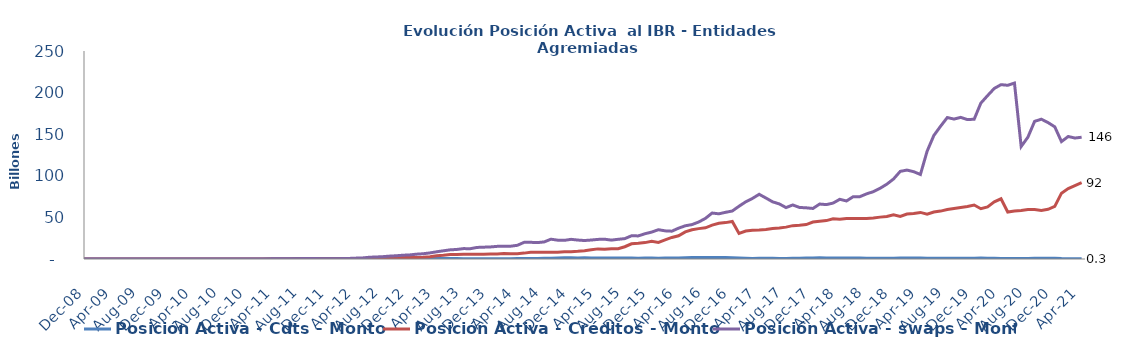
| Category | Posición Activa - Cdts - Monto | Posición Activa - Créditos - Monto | Posición Activa - swaps - Monto |
|---|---|---|---|
| 2008-07-01 | 0 | 0 | 0 |
| 2008-08-01 | 0 | 0 | 0 |
| 2008-09-01 | 0 | 0 | 0 |
| 2008-10-01 | 0 | 0 | 0 |
| 2008-11-01 | 0 | 0 | 0 |
| 2008-12-01 | 0 | 0 | 0 |
| 2009-01-01 | 0 | 0 | 0 |
| 2009-02-01 | 7428500000 | 0 | 0 |
| 2009-03-01 | 7428500000 | 0 | 0 |
| 2009-04-01 | 7428500000 | 0 | 0 |
| 2009-05-01 | 7428500000 | 0 | 0 |
| 2009-06-01 | 7428500000 | 0 | 0 |
| 2009-07-01 | 7428500000 | 0 | 0 |
| 2009-08-01 | 7428500000 | 0 | 0 |
| 2009-09-01 | 7428500000 | 0 | 0 |
| 2009-10-01 | 7928500000 | 0 | 0 |
| 2009-11-01 | 22928500000 | 0 | 0 |
| 2009-12-01 | 22928500000 | 0 | 0 |
| 2010-01-01 | 22928500000 | 0 | 400000000 |
| 2010-02-01 | 22928500000 | 0 | 400000000 |
| 2010-03-01 | 22928500000 | 0 | 1300000000 |
| 2010-04-01 | 22928500000 | 0 | 9300000000 |
| 2010-05-01 | 22928500000 | 0 | 24000000000 |
| 2010-06-01 | 22928500000 | 0 | 35000000000 |
| 2010-07-01 | 22928500000 | 0 | 49000000000 |
| 2010-08-01 | 15500000000 | 0 | 51000000000 |
| 2010-09-01 | 15500000000 | 0 | 42000000000 |
| 2010-10-01 | 62500000000 | 0 | 41000000000 |
| 2010-11-01 | 79500000000 | 0 | 29000000000 |
| 2010-12-01 | 81500000000 | 0 | 22000000000 |
| 2011-01-01 | 86000000000 | 0 | 23500000000 |
| 2011-02-01 | 134000000000 | 0 | 79500000000 |
| 2011-03-01 | 251400000000 | 0 | 114500000000 |
| 2011-04-01 | 282400000000 | 0 | 212500000000 |
| 2011-05-01 | 311900000000 | 0 | 246500000000 |
| 2011-06-01 | 450924000000 | 0 | 280500000000 |
| 2011-07-01 | 628924000000 | 0 | 307500000000 |
| 2011-08-01 | 650424000000 | 0 | 496500000000 |
| 2011-09-01 | 590324000000 | 0 | 493500000000 |
| 2011-10-01 | 571324000000 | 0 | 503000000000 |
| 2011-11-01 | 564354000000 | 0 | 357000000000 |
| 2011-12-01 | 573354000000 | 0 | 348000000000 |
| 2012-01-01 | 578854000000 | 0 | 368000000000 |
| 2012-02-01 | 569324000000 | 0 | 469000000000 |
| 2012-03-01 | 394324000000 | 0 | 708000000000 |
| 2012-04-01 | 362824000000 | 0 | 1052500000000 |
| 2012-05-01 | 425324000000 | 0 | 1321850000000 |
| 2012-06-01 | 472528000000 | 0 | 2131450000000 |
| 2012-07-01 | 467028000000 | 10736400932.6 | 2430450000000 |
| 2012-08-01 | 467028000000 | 395898409383.73 | 2831550000000 |
| 2012-09-01 | 514128000000 | 1278623915608.46 | 3465550000000 |
| 2012-10-01 | 528328000000 | 1409219995143.76 | 3916900000000 |
| 2012-11-01 | 503328000000 | 1739292606539.45 | 4543100000000 |
| 2012-12-01 | 538118000000 | 1753702085065.83 | 4921600000000 |
| 2013-01-01 | 612118000000 | 1860190799905.28 | 5800050000000 |
| 2013-02-01 | 567619540000 | 2113733072125.38 | 6318174692981 |
| 2013-03-01 | 626411310533 | 2638808537970.97 | 7322374692981 |
| 2013-04-01 | 629111310533 | 3794306574436.62 | 8687553692981 |
| 2013-05-01 | 639011310533 | 4443519152060.31 | 9853614804093 |
| 2013-06-01 | 579211310533 | 5441636414484 | 11004589051114 |
| 2013-07-01 | 619911310533 | 5276885903223 | 11472101064827 |
| 2013-08-01 | 264748310533 | 5793112373612 | 12500291064827 |
| 2013-09-01 | 235198310533 | 5781182186427 | 12379491064827 |
| 2013-10-01 | 287324065335 | 5721227676911.381 | 13896537064827 |
| 2013-11-01 | 330716307053.16 | 5769151414412.79 | 14219298533045 |
| 2013-12-01 | 351289281441 | 6033441138708.75 | 14497299602830 |
| 2014-01-01 | 415560557858 | 5904465606780.36 | 15189393602830 |
| 2014-02-01 | 421812163336 | 6592170750743.01 | 15247970102830 |
| 2014-03-01 | 398635445434 | 6454762439295.27 | 15371390390463 |
| 2014-04-01 | 505726541829 | 6413323429971.03 | 16452051310463 |
| 2014-05-01 | 522799425000 | 7069454807140.37 | 19992594629221.91 |
| 2014-06-01 | 617169430000 | 8104068718395.04 | 20048124203761.16 |
| 2014-07-01 | 680622729450 | 8165185122690.54 | 19722335424382.492 |
| 2014-08-01 | 756139827000 | 8078177412953.88 | 20517588213883 |
| 2014-09-01 | 938513426809.328 | 8003623952520.778 | 23817248811402.992 |
| 2014-10-01 | 1085627969999.998 | 8010472710623.305 | 22656264562178.992 |
| 2014-11-01 | 1356560691367.905 | 8724921587924.001 | 22396570950523 |
| 2014-12-01 | 1367078350000 | 8797305493724.32 | 23642742101498 |
| 2015-01-01 | 1293754500000 | 9263385595110.854 | 22764940027082.715 |
| 2015-02-01 | 1390322000000 | 10008403554124.396 | 22210507490027 |
| 2015-03-01 | 1291122000000 | 11056737501660.055 | 22789161192534.68 |
| 2015-04-01 | 1155322000000 | 12157445776599.592 | 23567227758727.7 |
| 2015-05-01 | 1089813000000 | 11714375535106.436 | 23774907278634.305 |
| 2015-06-01 | 1141513000000 | 12407392413540.484 | 22696018508157.156 |
| 2015-07-01 | 1269327666147 | 12421253163765.184 | 23667535655155.49 |
| 2015-08-01 | 1149827666147 | 14732094647912.19 | 24499865405155.484 |
| 2015-09-01 | 1094927666147 | 18275955310324.863 | 27906116302241.14 |
| 2015-10-01 | 986527666147 | 18878869867150.16 | 27759640112993.98 |
| 2015-11-01 | 1087027666147 | 19694520524655.047 | 30367137758015.98 |
| 2015-12-01 | 1081027666147 | 21192540679005.13 | 32342306254816.98 |
| 2016-01-01 | 1038064375438.43 | 19977514817492.54 | 35212979556095.375 |
| 2016-02-01 | 1068049372938.43 | 22902299660100.133 | 33822025975882.445 |
| 2016-03-01 | 1257396510438.43 | 25918368881639.652 | 33434779272390.047 |
| 2016-04-01 | 1145425000000 | 27903668641981.312 | 37046880484154.11 |
| 2016-05-01 | 1531395000000 | 32621114880164.73 | 39908396979761.27 |
| 2016-06-01 | 1705195000000 | 35183640497890.742 | 41366680595973.1 |
| 2016-07-01 | 1836308000000 | 36521841812503.32 | 44471316930976.79 |
| 2016-08-01 | 1870808000000 | 37465674066332.95 | 48816567034654.92 |
| 2016-09-01 | 1929687493130 | 40686213476757.7 | 55251579491117.45 |
| 2016-10-01 | 1882682961712 | 42864686598625.914 | 54309484290905.336 |
| 2016-11-01 | 1878248867176 | 43733971005961.09 | 56118948154012.44 |
| 2016-12-01 | 1468748425000 | 45151117036611.55 | 57699253311873.81 |
| 2017-01-01 | 1143108000000 | 30719580969277.98 | 63422656832652.35 |
| 2017-02-01 | 959983000000 | 33544129154349.8 | 68757567415515.25 |
| 2017-03-01 | 577051000000 | 34462812060371.684 | 72819778766690.34 |
| 2017-04-01 | 885158000000 | 34827145198479.086 | 77767325467809.62 |
| 2017-05-01 | 833037000000 | 35497786022672.44 | 73316207022947.58 |
| 2017-06-01 | 767212000000 | 36768829278716.77 | 68724115566899.586 |
| 2017-07-01 | 723063100000 | 37293790277269.41 | 66196996418075.26 |
| 2017-08-01 | 737198200000 | 38317542250005.2 | 61794201909898.49 |
| 2017-09-01 | 851825800000 | 40079477161418.875 | 64956887148155.3 |
| 2017-10-01 | 875668400000 | 40535657583816.695 | 61960974775715.3 |
| 2017-11-01 | 1217681607735 | 41397643384740.86 | 61523240467384.72 |
| 2017-12-01 | 1195773462000 | 44372983729678.305 | 60736713351879.72 |
| 2018-01-01 | 1486153000000 | 45316260145228 | 66047253084281.72 |
| 2018-02-01 | 1328803000000 | 46162206571708.07 | 65387773354256.72 |
| 2018-03-01 | 1305953000000 | 48453443068790.65 | 67190421317837.914 |
| 2018-04-01 | 1282453000000 | 47890324452343.98 | 71760271521781.73 |
| 2018-05-01 | 1171161000000 | 48725588703126.695 | 69749268129720.266 |
| 2018-06-01 | 1178361000000 | 48565406337446.484 | 74906865920231.27 |
| 2018-07-01 | 1147911000000 | 48583592953609.9 | 74953597215347.72 |
| 2018-08-01 | 974361000000 | 48739509325405.945 | 78336828076056.03 |
| 2018-09-01 | 880511000000 | 49155342171520.125 | 80926405096788.67 |
| 2018-10-01 | 906123269800 | 50329644979668.08 | 85000285327947.73 |
| 2018-11-01 | 935178269800 | 51067718130478.16 | 89917602044952.98 |
| 2018-12-01 | 983678269800 | 53154821210309.25 | 96170753499983.2 |
| 2019-01-01 | 1280276927898.07 | 51241611103004.125 | 105342711964485.36 |
| 2019-02-01 | 1317202390483.93 | 54060435828151.195 | 106871828205756.19 |
| 2019-03-01 | 1263773151583.71 | 54692666315083.05 | 104945975072707.31 |
| 2019-04-01 | 1246768411398 | 55991641247250.68 | 101579729933697.45 |
| 2019-05-01 | 1012341181800 | 53805320644815.23 | 129568137269667.69 |
| 2019-06-01 | 999138572800 | 56508944560043.25 | 148452268415643.94 |
| 2019-07-01 | 952207980300 | 57562475653317.766 | 159554889555444.84 |
| 2019-08-01 | 990963550348 | 59413925521552.75 | 170008456352171.3 |
| 2019-09-01 | 916745301648 | 60644336673555.46 | 168191675391740.5 |
| 2019-10-01 | 893433031848 | 61908575234728.445 | 170225602844305.4 |
| 2019-11-01 | 965433031848 | 63113224205513.6 | 167546382534157.9 |
| 2019-12-01 | 1006133031848 | 64853593354215.56 | 167987758390619.75 |
| 2020-01-01 | 1079446125000 | 60383018256183.08 | 187404097529714.88 |
| 2020-02-01 | 829796125000 | 62664707682769.06 | 196385518709791.3 |
| 2020-03-01 | 862796125000 | 68635142434162.8 | 205041712084257.16 |
| 2020-04-01 | 653796125000 | 72332705337619.36 | 209548403708229.16 |
| 2020-05-01 | 717881961000 | 56428058644781.41 | 208789115994062.22 |
| 2020-06-01 | 551381961000 | 57588401646949.22 | 211495606863987.9 |
| 2020-07-01 | 732005126000 | 58193661131624.32 | 135203260336431.1 |
| 2020-08-01 | 705505126000 | 59428327063930.086 | 146418634033936.2 |
| 2020-09-01 | 1010148909000 | 59349190863880.625 | 165421776100814.16 |
| 2020-10-01 | 967817581000 | 58309689466295.79 | 168070447871313.84 |
| 2020-11-01 | 1001498553000 | 59717517061764.59 | 163974600898030.06 |
| 2020-12-01 | 1001032058000 | 63259230959041.59 | 158843728236989.25 |
| 2021-01-01 | 465793000000 | 79101579855207.8 | 141107481200181 |
| 2021-02-01 | 436378831900 | 84695883610147.72 | 147240614783922.16 |
| 2021-03-01 | 419878831900 | 88300567888372.36 | 145397108361361.03 |
| 2021-04-01 | 334878831900 | 91747765483185.47 | 146340873830453.1 |